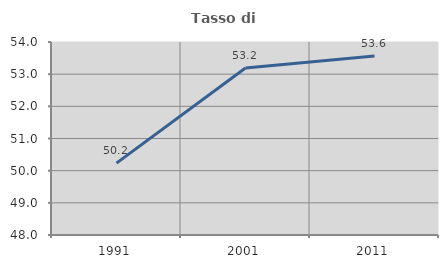
| Category | Tasso di occupazione   |
|---|---|
| 1991.0 | 50.234 |
| 2001.0 | 53.193 |
| 2011.0 | 53.562 |